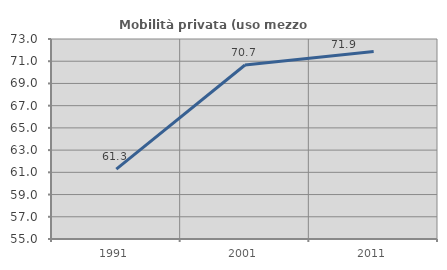
| Category | Mobilità privata (uso mezzo privato) |
|---|---|
| 1991.0 | 61.289 |
| 2001.0 | 70.657 |
| 2011.0 | 71.881 |